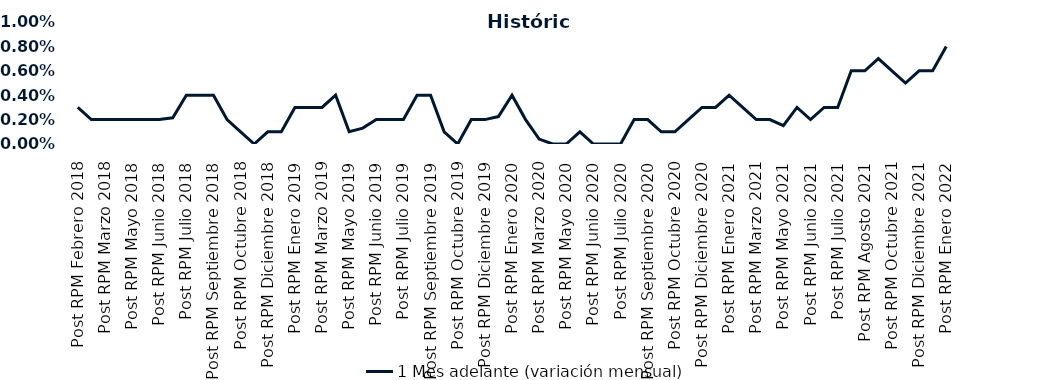
| Category | 1 Mes adelante (variación mensual) |
|---|---|
| Post RPM Febrero 2018 | 0.003 |
| Pre RPM Marzo 2018 | 0.002 |
| Post RPM Marzo 2018 | 0.002 |
| Pre RPM Mayo 2018 | 0.002 |
| Post RPM Mayo 2018 | 0.002 |
| Pre RPM Junio 2018 | 0.002 |
| Post RPM Junio 2018 | 0.002 |
| Pre RPM Julio 2018 | 0.002 |
| Post RPM Julio 2018 | 0.004 |
| Pre RPM Septiembre 2018 | 0.004 |
| Post RPM Septiembre 2018 | 0.004 |
| Pre RPM Octubre 2018 | 0.002 |
| Post RPM Octubre 2018 | 0.001 |
| Pre RPM Diciembre 2018 | 0 |
| Post RPM Diciembre 2018 | 0.001 |
| Pre RPM Enero 2019 | 0.001 |
| Post RPM Enero 2019 | 0.003 |
| Pre RPM Marzo 2019 | 0.003 |
| Post RPM Marzo 2019 | 0.003 |
| Pre RPM Mayo 2019 | 0.004 |
| Post RPM Mayo 2019 | 0.001 |
| Pre RPM Junio 2019 | 0.001 |
| Post RPM Junio 2019 | 0.002 |
| Pre RPM Julio 2019 | 0.002 |
| Post RPM Julio 2019 | 0.002 |
| Pre RPM Septiembre 2019 | 0.004 |
| Post RPM Septiembre 2019 | 0.004 |
| Pre RPM Octubre 2019 | 0.001 |
| Post RPM Octubre 2019 | 0 |
| Pre RPM Diciembre 2019 | 0.002 |
| Post RPM Diciembre 2019 | 0.002 |
| Pre RPM Enero 2020 | 0.002 |
| Post RPM Enero 2020 | 0.004 |
| Pre RPM Marzo 2020 | 0.002 |
| Post RPM Marzo 2020 | 0 |
| Pre RPM Mayo 2020 | 0 |
| Post RPM Mayo 2020 | 0 |
| Pre RPM Junio 2020 | 0.001 |
| Post RPM Junio 2020 | 0 |
| Pre RPM Julio 2020 | 0 |
| Post RPM Julio 2020 | 0 |
| Pre RPM Septiembre 2020 | 0.002 |
| Post RPM Septiembre 2020 | 0.002 |
| Pre RPM Octubre 2020 | 0.001 |
| Post RPM Octubre 2020 | 0.001 |
| Pre RPM Diciembre 2020 | 0.002 |
| Post RPM Diciembre 2020 | 0.003 |
| Pre RPM Enero 2021 | 0.003 |
| Post RPM Enero 2021 | 0.004 |
| Pre RPM Marzo 2021 | 0.003 |
| Post RPM Marzo 2021 | 0.002 |
| Pre RPM Mayo 2021 | 0.002 |
| Post RPM Mayo 2021 | 0.002 |
| Pre RPM Junio 2021 | 0.003 |
| Post RPM Junio 2021 | 0.002 |
| Pre RPM Julio 2021 | 0.003 |
| Post RPM Julio 2021 | 0.003 |
| Pre RPM Agosto 2021 | 0.006 |
| Post RPM Agosto 2021 | 0.006 |
| Pre RPM Octubre 2021 | 0.007 |
| Post RPM Octubre 2021 | 0.006 |
| Pre RPM Diciembre 2021 | 0.005 |
| Post RPM Diciembre 2021 | 0.006 |
| Pre RPM Enero 2022 | 0.006 |
| Post RPM Enero 2022 | 0.008 |